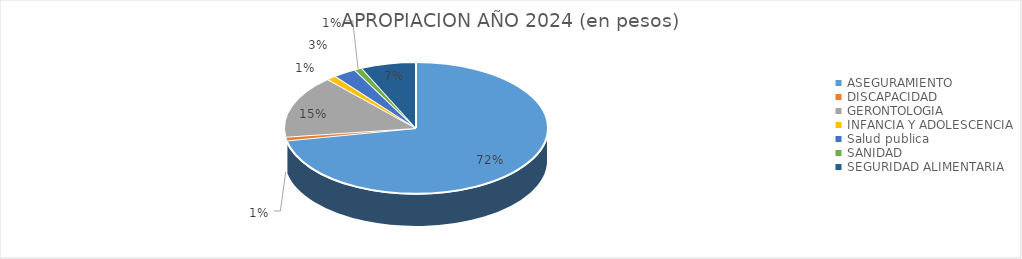
| Category | APROPIACION AÑO 2024 (en pesos) |
|---|---|
| ASEGURAMIENTO | 21501928915 |
| DISCAPACIDAD | 269513126 |
| GERONTOLOGIA | 4617045670.05 |
| INFANCIA Y ADOLESCENCIA | 356953211 |
| Salud publica | 837120000 |
| SANIDAD | 285181666 |
| SEGURIDAD ALIMENTARIA | 2018118277 |